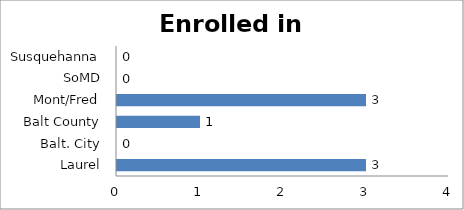
| Category | Enrolled in W&L |
|---|---|
| Laurel | 3 |
| Balt. City | 0 |
| Balt County | 1 |
| Mont/Fred | 3 |
| SoMD | 0 |
| Susquehanna | 0 |